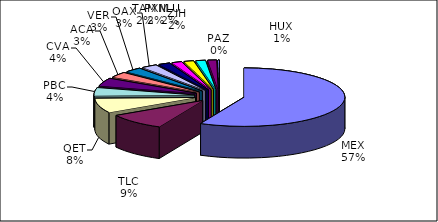
| Category | Series 0 |
|---|---|
| MEX | 430980 |
| TLC | 70695 |
| QET | 61194 |
| PBC | 33919 |
| CVA | 33394 |
| ACA | 22739 |
| VER | 20821 |
| OAX | 18965 |
| TAM | 13959 |
| ZIH | 12189 |
| PXM | 11784 |
| NLU | 11535 |
| HUX | 10648 |
| PAZ | 1744 |